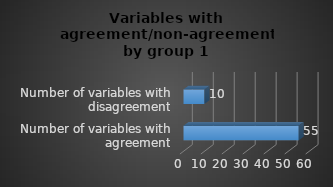
| Category | Series 0 |
|---|---|
| Number of variables with agreement | 55 |
| Number of variables with disagreement | 10 |